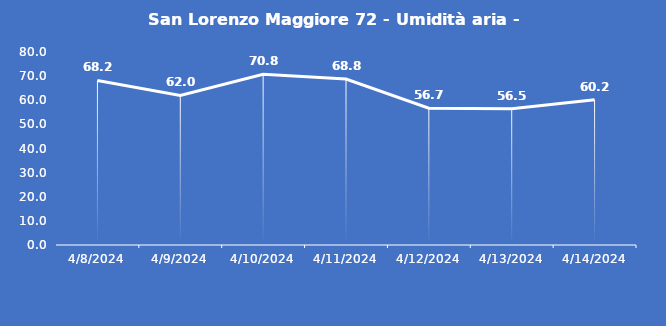
| Category | San Lorenzo Maggiore 72 - Umidità aria - Grezzo (%) |
|---|---|
| 4/8/24 | 68.2 |
| 4/9/24 | 62 |
| 4/10/24 | 70.8 |
| 4/11/24 | 68.8 |
| 4/12/24 | 56.7 |
| 4/13/24 | 56.5 |
| 4/14/24 | 60.2 |